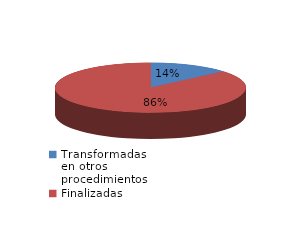
| Category | Series 0 |
|---|---|
| Transformadas en otros procedimientos | 1109 |
| Finalizadas | 7062 |